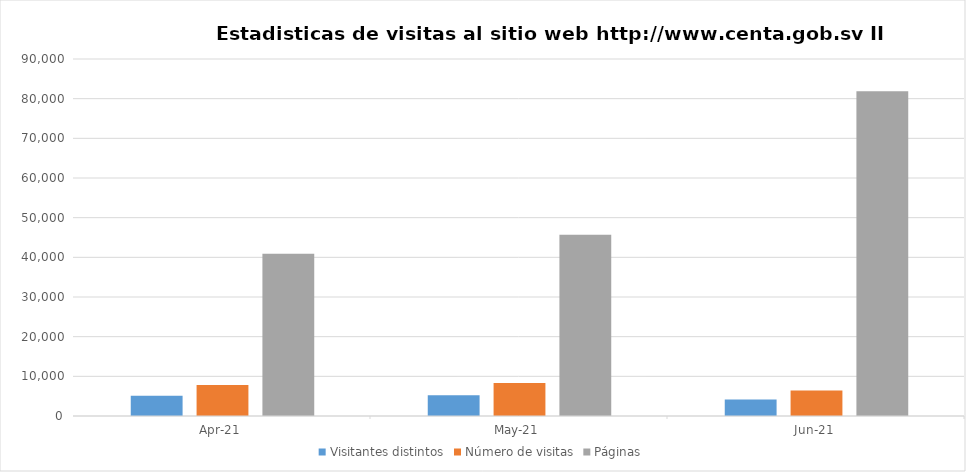
| Category | Visitantes distintos | Número de visitas | Páginas |
|---|---|---|---|
| 2021-04-01 | 5125 | 7835 | 40922 |
| 2021-05-01 | 5220 | 8299 | 45692 |
| 2021-06-01 | 4174 | 6426 | 81839 |